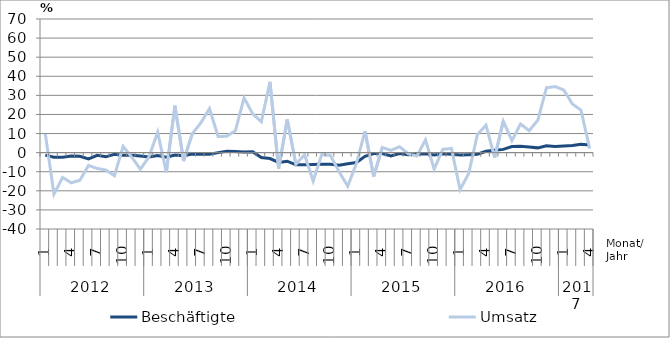
| Category | Beschäftigte | Umsatz |
|---|---|---|
| 0 | -1.3 | 9.8 |
| 1 | -2.4 | -21.7 |
| 2 | -2.4 | -13 |
| 3 | -1.8 | -15.8 |
| 4 | -1.9 | -14.5 |
| 5 | -3.3 | -6.7 |
| 6 | -1.4 | -8.3 |
| 7 | -2.2 | -9.1 |
| 8 | -0.9 | -12.1 |
| 9 | -1.4 | 3.3 |
| 10 | -1.4 | -2.3 |
| 11 | -1.8 | -8.7 |
| 12 | -2.3 | -2.2 |
| 13 | -1.5 | 10.7 |
| 14 | -2.4 | -10.3 |
| 15 | -1.3 | 24.6 |
| 16 | -1.6 | -4.4 |
| 17 | -0.7 | 9.9 |
| 18 | -0.8 | 15.6 |
| 19 | -0.8 | 23.1 |
| 20 | 0 | 8.4 |
| 21 | 0.7 | 8.6 |
| 22 | 0.6 | 11.5 |
| 23 | 0.3 | 28.7 |
| 24 | 0.5 | 20.3 |
| 25 | -2.6 | 16.2 |
| 26 | -3.1 | 37.1 |
| 27 | -5.1 | -8.5 |
| 28 | -4.5 | 17.4 |
| 29 | -6.4 | -6.1 |
| 30 | -6.4 | -1.1 |
| 31 | -6.2 | -14.9 |
| 32 | -6.1 | -0.9 |
| 33 | -6.1 | -1.5 |
| 34 | -6.6 | -10 |
| 35 | -5.8 | -17.6 |
| 36 | -5.2 | -5.7 |
| 37 | -1.9 | 11.2 |
| 38 | -0.5 | -12.5 |
| 39 | -0.5 | 2.7 |
| 40 | -1.7 | 1.2 |
| 41 | -0.5 | 3.1 |
| 42 | -1.1 | -0.6 |
| 43 | -0.8 | -1.8 |
| 44 | -0.6 | 6.7 |
| 45 | -1.2 | -8.6 |
| 46 | -0.6 | 1.7 |
| 47 | -0.9 | 2.2 |
| 48 | -1.3 | -19.4 |
| 49 | -1.1 | -10.9 |
| 50 | -0.8 | 9.4 |
| 51 | 0.7 | 14.4 |
| 52 | 1.2 | -2.6 |
| 53 | 1.7 | 16.5 |
| 54 | 3.2 | 6.3 |
| 55 | 3.4 | 15 |
| 56 | 3 | 11.5 |
| 57 | 2.5 | 17 |
| 58 | 3.6 | 34 |
| 59 | 3.2 | 34.6 |
| 60 | 3.5 | 32.8 |
| 61 | 3.8 | 25.5 |
| 62 | 4.4 | 22.2 |
| 63 | 4 | 2.1 |